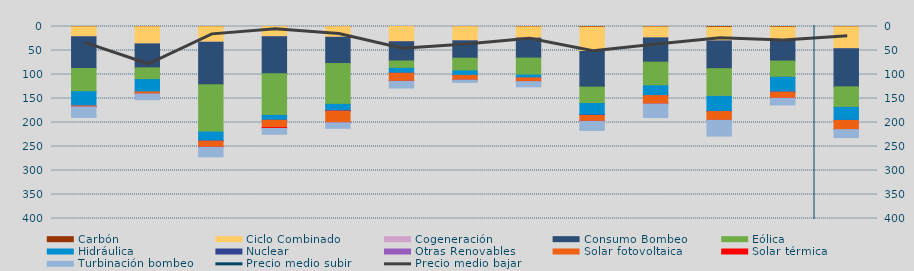
| Category | Carbón | Ciclo Combinado | Cogeneración | Consumo Bombeo | Eólica | Hidráulica | Nuclear | Otras Renovables | Solar fotovoltaica | Solar térmica | Turbinación bombeo |
|---|---|---|---|---|---|---|---|---|---|---|---|
| E | 624.15 | 20714.774 | 137.817 | 66005.482 | 48358.133 | 29783.675 | 0 | 1 | 1942.858 | 28.625 | 21792.308 |
| F | 573.3 | 35710.625 | 48.25 | 49890.275 | 24355.325 | 25831 | 0 | 0 | 3780.125 | 69.225 | 12196.8 |
| M | 501.25 | 32124.392 | 164.517 | 88685.498 | 98417.968 | 18612.512 | 448.75 | 16.575 | 11880.15 | 572.625 | 20112.843 |
| A | 170 | 20766.184 | 571.725 | 76937.455 | 86761.121 | 10133.333 | 40.925 | 0 | 14988.025 | 2004.65 | 12082.525 |
| M | 320.375 | 21993.7 | 252.925 | 54297.65 | 85403.658 | 12766.317 | 1357.65 | 14.475 | 23573.033 | 453.85 | 11577.425 |
| J | 92.075 | 31710.184 | 28.017 | 39954.501 | 15416.333 | 10344.86 | 11.25 | 38.75 | 16255.675 | 192.1 | 14074.425 |
| J | 322.925 | 29487.87 | 56.5 | 36148.45 | 26555.431 | 9322.947 | 0 | 27.5 | 9428.357 | 218.775 | 4884.775 |
| A | 791.025 | 23383.803 | 61.5 | 41567.115 | 35359.804 | 6042.439 | 0 | 145.075 | 7086.59 | 334.925 | 10897.775 |
| S | 1345.508 | 50563.018 | 49 | 74303.001 | 34150.357 | 24005.525 | 791.75 | 160.275 | 11766.108 | 299.95 | 19108.925 |
| O | 964.4 | 22845.583 | 47.775 | 50475.258 | 49132.629 | 20329.391 | 212.725 | 38.5 | 17232.379 | 91.15 | 28366.325 |
| N | 1675.475 | 28385.494 | 112.05 | 57681.133 | 57832.261 | 31092.689 | 423.675 | 64.5 | 18121.278 | 19.725 | 32908.825 |
| D | 1291.775 | 26696.399 | 169.083 | 43871.908 | 33826.738 | 30780.378 | 259.75 | 35 | 12513.415 | 4.05 | 13991.525 |
| E | 673.35 | 45550.095 | 276.35 | 79325.525 | 42752.623 | 26953.973 | 125.625 | 150.25 | 18925.839 | 33.4 | 16698.8 |